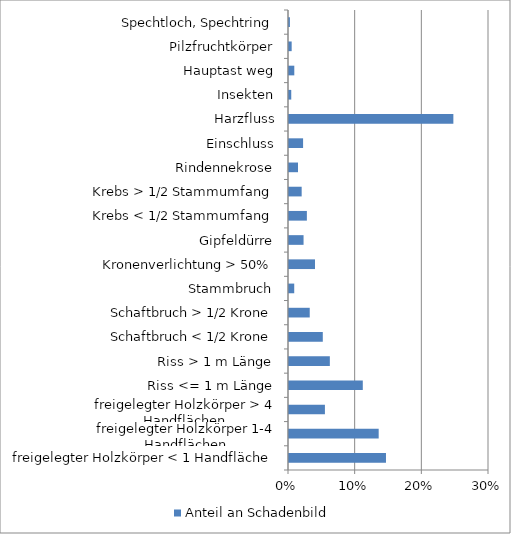
| Category | Anteil an Schadenbild |
|---|---|
| freigelegter Holzkörper < 1 Handfläche | 0.145 |
| freigelegter Holzkörper 1-4 Handflächen | 0.135 |
| freigelegter Holzkörper > 4 Handflächen | 0.054 |
| Riss <= 1 m Länge | 0.111 |
| Riss > 1 m Länge | 0.061 |
| Schaftbruch < 1/2 Krone | 0.051 |
| Schaftbruch > 1/2 Krone | 0.031 |
| Stammbruch | 0.008 |
| Kronenverlichtung > 50% | 0.039 |
| Gipfeldürre | 0.022 |
| Krebs < 1/2 Stammumfang | 0.027 |
| Krebs > 1/2 Stammumfang | 0.019 |
| Rindennekrose | 0.014 |
| Einschluss | 0.021 |
| Harzfluss | 0.247 |
| Insekten | 0.003 |
| Hauptast weg | 0.008 |
| Pilzfruchtkörper | 0.004 |
| Spechtloch, Spechtring | 0.001 |